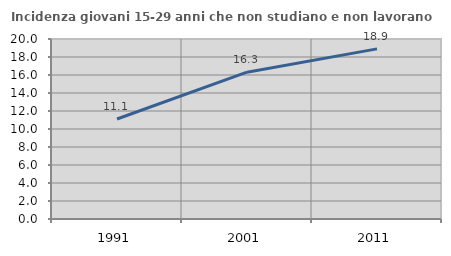
| Category | Incidenza giovani 15-29 anni che non studiano e non lavorano  |
|---|---|
| 1991.0 | 11.111 |
| 2001.0 | 16.315 |
| 2011.0 | 18.904 |